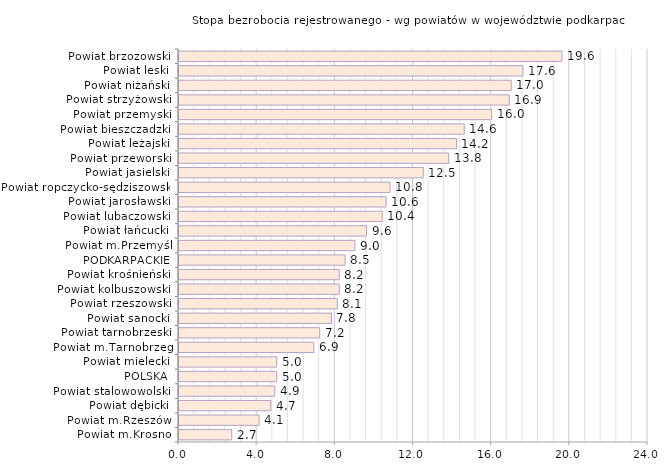
| Category | Stopa bezrobocia rejestrowanego - wg powiatów w województwie podkarpackim |
|---|---|
| Powiat m.Krosno | 2.7 |
| Powiat m.Rzeszów | 4.1 |
| Powiat dębicki | 4.7 |
| Powiat stalowowolski | 4.9 |
| POLSKA | 5 |
| Powiat mielecki | 5 |
| Powiat m.Tarnobrzeg | 6.9 |
| Powiat tarnobrzeski | 7.2 |
| Powiat sanocki | 7.8 |
| Powiat rzeszowski | 8.1 |
| Powiat kolbuszowski | 8.2 |
| Powiat krośnieński | 8.2 |
| PODKARPACKIE | 8.5 |
| Powiat m.Przemyśl | 9 |
| Powiat łańcucki | 9.6 |
| Powiat lubaczowski | 10.4 |
| Powiat jarosławski | 10.6 |
| Powiat ropczycko-sędziszowski | 10.8 |
| Powiat jasielski | 12.5 |
| Powiat przeworski | 13.8 |
| Powiat leżajski | 14.2 |
| Powiat bieszczadzki | 14.6 |
| Powiat przemyski | 16 |
| Powiat strzyżowski | 16.9 |
| Powiat niżański | 17 |
| Powiat leski | 17.6 |
| Powiat brzozowski | 19.6 |